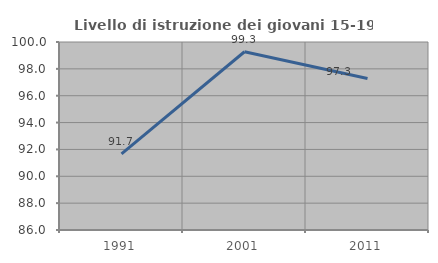
| Category | Livello di istruzione dei giovani 15-19 anni |
|---|---|
| 1991.0 | 91.667 |
| 2001.0 | 99.273 |
| 2011.0 | 97.287 |